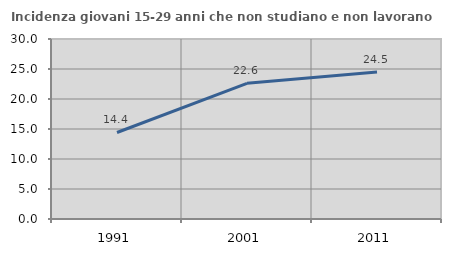
| Category | Incidenza giovani 15-29 anni che non studiano e non lavorano  |
|---|---|
| 1991.0 | 14.419 |
| 2001.0 | 22.615 |
| 2011.0 | 24.483 |